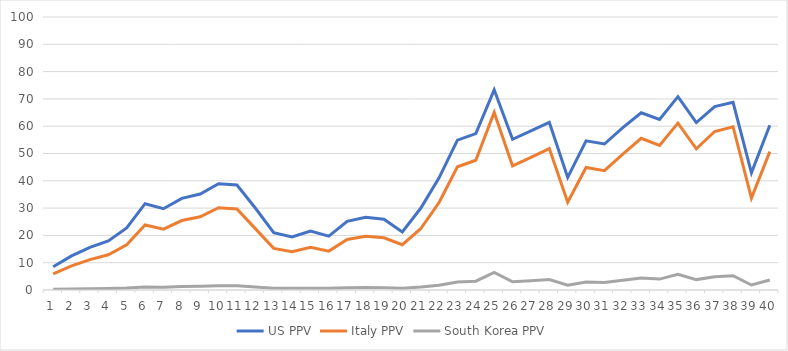
| Category | US PPV | Italy PPV | South Korea PPV |
|---|---|---|---|
| 0 | 8.52 | 5.92 | 0.23 |
| 1 | 12.5 | 8.81 | 0.36 |
| 2 | 15.63 | 11.13 | 0.46 |
| 3 | 17.99 | 12.91 | 0.55 |
| 4 | 22.74 | 16.59 | 0.73 |
| 5 | 31.61 | 23.8 | 1.14 |
| 6 | 29.77 | 22.27 | 1.05 |
| 7 | 33.55 | 25.44 | 1.25 |
| 8 | 35.15 | 26.81 | 1.34 |
| 9 | 38.95 | 30.13 | 1.57 |
| 10 | 38.48 | 29.71 | 1.54 |
| 11 | 30.04 | 22.49 | 1.06 |
| 12 | 21.02 | 15.25 | 0.66 |
| 13 | 19.45 | 14.03 | 0.6 |
| 14 | 21.57 | 15.67 | 0.68 |
| 15 | 19.72 | 14.24 | 0.61 |
| 16 | 25.17 | 18.52 | 0.83 |
| 17 | 26.62 | 19.69 | 0.9 |
| 18 | 25.92 | 19.13 | 0.87 |
| 19 | 21.29 | 16.6 | 0.67 |
| 20 | 29.93 | 22.44 | 1.06 |
| 21 | 41.09 | 32.03 | 1.71 |
| 22 | 54.91 | 45.15 | 2.95 |
| 23 | 57.27 | 47.53 | 3.24 |
| 24 | 73.33 | 65.02 | 6.43 |
| 25 | 55.21 | 45.45 | 2.99 |
| 26 | 58.28 | 48.56 | 3.37 |
| 27 | 61.41 | 51.82 | 3.83 |
| 28 | 41.23 | 32.17 | 1.72 |
| 29 | 54.64 | 44.88 | 2.92 |
| 30 | 53.48 | 43.73 | 2.79 |
| 31 | 59.48 | 49.8 | 3.54 |
| 32 | 64.92 | 55.57 | 4.42 |
| 33 | 62.46 | 52.93 | 3.99 |
| 34 | 70.82 | 61.13 | 5.72 |
| 35 | 61.33 | 51.72 | 3.81 |
| 36 | 67.2 | 58.06 | 4.87 |
| 37 | 68.77 | 59.81 | 5.22 |
| 38 | 42.9 | 33.68 | 1.84 |
| 39 | 60.34 | 50.7 | 3.66 |